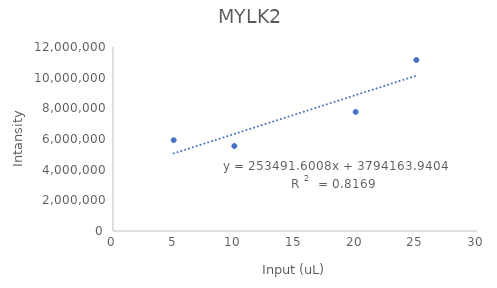
| Category | Series 0 |
|---|---|
| 20.0 | 7766416 |
| 5.0 | 5923750.387 |
| nan | 8103664.677 |
| 10.0 | 5545435.344 |
| 25.0 | 11150550.08 |